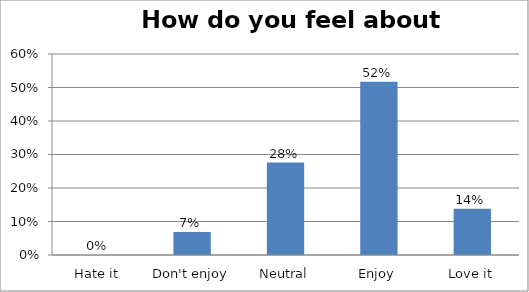
| Category | Series 0 |
|---|---|
| Hate it | 0 |
| Don't enjoy | 0.069 |
| Neutral | 0.276 |
| Enjoy | 0.517 |
| Love it | 0.138 |